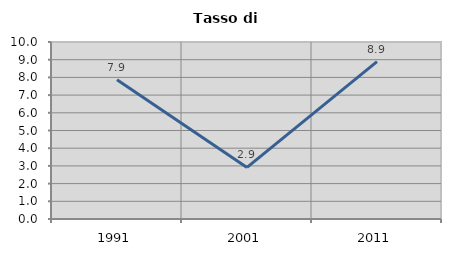
| Category | Tasso di disoccupazione   |
|---|---|
| 1991.0 | 7.865 |
| 2001.0 | 2.913 |
| 2011.0 | 8.889 |